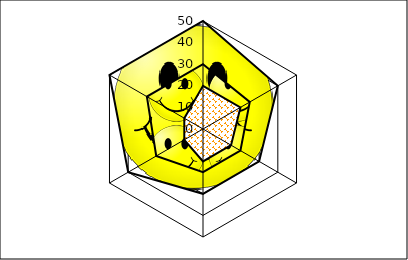
| Category | Series 1 | Series 2 | Series 3 |
|---|---|---|---|
| Point 1 | 50 | 30 | 20 |
| Point 2 | 40 | 25 | 20 |
| Point 3 | 30 | 20 | 15 |
| Point 4 | 30 | 20 | 15 |
| Point 5 | 40 | 25 | 10 |
| Point 6 | 50 | 30 | 10 |